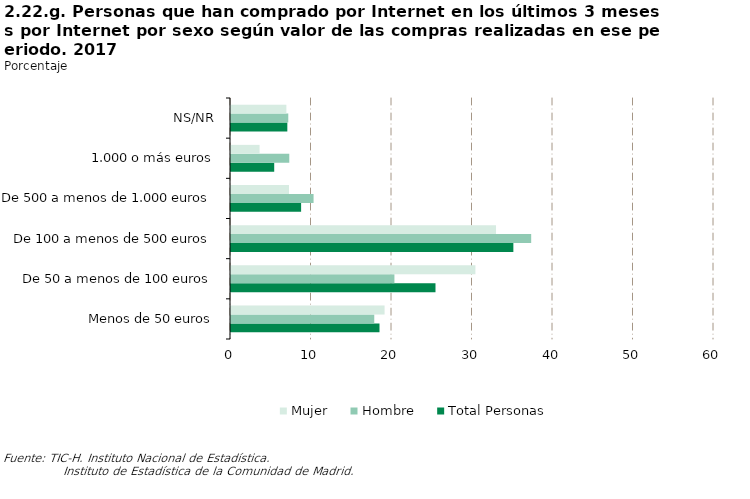
| Category | Total Personas | Hombre | Mujer |
|---|---|---|---|
| Menos de 50 euros | 18.446 | 17.795 | 19.079 |
| De 50 a menos de 100 euros | 25.403 | 20.302 | 30.362 |
| De 100 a menos de 500 euros | 35.076 | 37.29 | 32.923 |
| De 500 a menos de 1.000 euros | 8.71 | 10.256 | 7.207 |
| 1.000 o más euros | 5.368 | 7.24 | 3.548 |
| NS/NR | 6.997 | 7.116 | 6.881 |